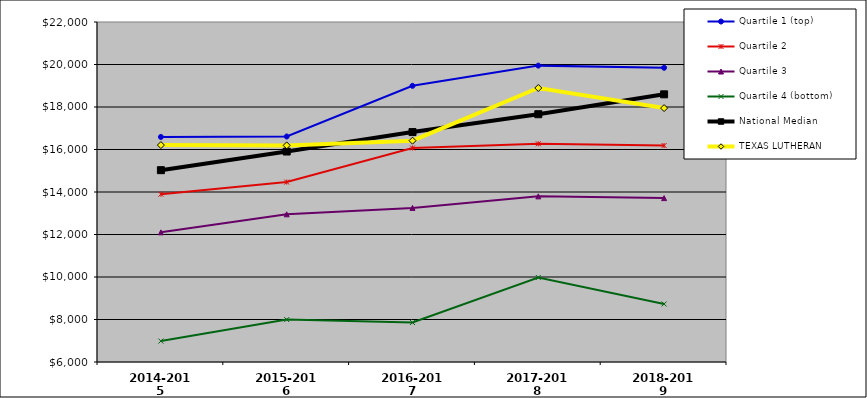
| Category | Quartile 1 (top) | Quartile 2 | Quartile 3 | Quartile 4 (bottom) | National Median |  TEXAS LUTHERAN  |
|---|---|---|---|---|---|---|
| 2014-2015 | 16590.5 | 13895 | 12102 | 6984 | 15026.5 | 16208 |
| 2015-2016 | 16611.5 | 14467 | 12950 | 7995 | 15904.5 | 16193 |
| 2016-2017 | 18996.5 | 16070 | 13251 | 7858 | 16820.5 | 16415 |
| 2017-2018 | 19947 | 16269 | 13794.5 | 9977 | 17661 | 18895 |
| 2018-2019 | 19846 | 16185 | 13712.5 | 8730 | 18596 | 17949 |